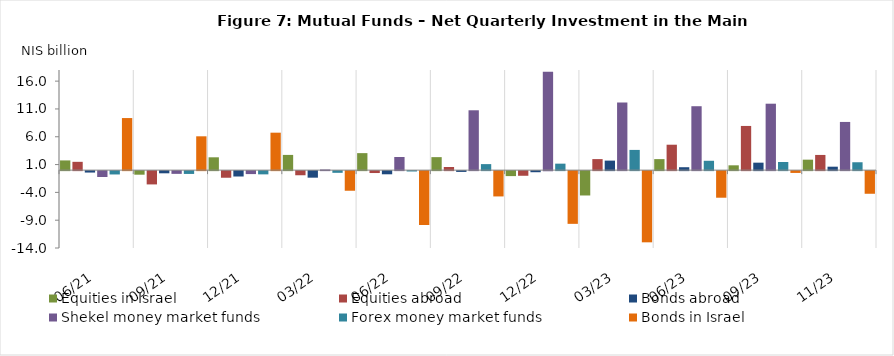
| Category | Equities in Israel | Equities abroad | Bonds abroad | Shekel money market funds | Forex money market funds | Bonds in Israel |
|---|---|---|---|---|---|---|
| 2021-06-30 | 1.745 | 1.492 | -0.257 | -1.055 | -0.599 | 9.361 |
| 2021-09-30 | -0.641 | -2.39 | -0.392 | -0.492 | -0.506 | 6.08 |
| 2021-12-31 | 2.305 | -1.189 | -0.967 | -0.533 | -0.581 | 6.731 |
| 2022-03-31 | 2.736 | -0.743 | -1.177 | 0.118 | -0.305 | -3.528 |
| 2022-06-30 | 3.055 | -0.343 | -0.569 | 2.36 | -0.066 | -9.686 |
| 2022-09-30 | 2.336 | 0.565 | -0.142 | 10.758 | 1.081 | -4.55 |
| 2022-12-31 | -0.895 | -0.835 | -0.198 | 17.674 | 1.163 | -9.478 |
| 2023-03-31 | -4.379 | 1.983 | 1.71 | 12.158 | 3.634 | -12.799 |
| 2023-06-30 | 1.98 | 4.569 | 0.523 | 11.488 | 1.682 | -4.781 |
| 2023-09-30 | 0.865 | 7.942 | 1.341 | 11.941 | 1.465 | -0.325 |
| 2023-11-30 | 1.881 | 2.73 | 0.618 | 8.663 | 1.415 | -4.07 |